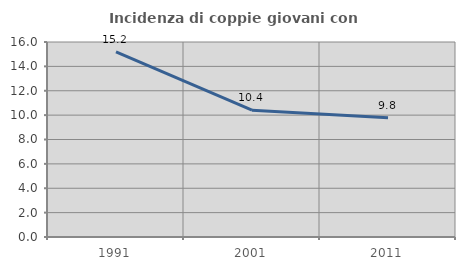
| Category | Incidenza di coppie giovani con figli |
|---|---|
| 1991.0 | 15.199 |
| 2001.0 | 10.409 |
| 2011.0 | 9.777 |